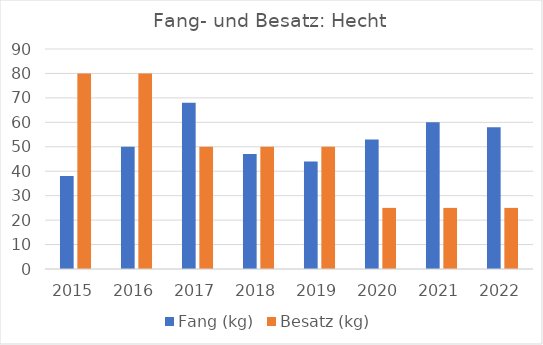
| Category | Fang (kg) | Besatz (kg) |
|---|---|---|
| 2015.0 | 38 | 80 |
| 2016.0 | 50 | 80 |
| 2017.0 | 68 | 50 |
| 2018.0 | 47 | 50 |
| 2019.0 | 44 | 50 |
| 2020.0 | 53 | 25 |
| 2021.0 | 60 | 25 |
| 2022.0 | 58 | 25 |